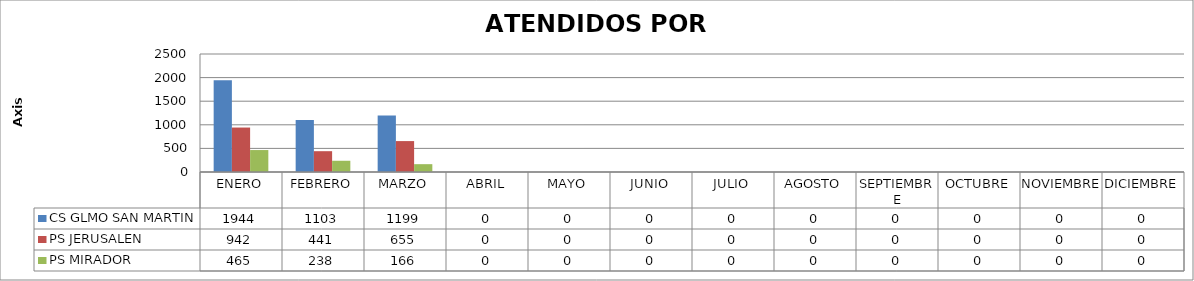
| Category | CS GLMO SAN MARTIN | PS JERUSALEN | PS MIRADOR |
|---|---|---|---|
| ENERO | 1944 | 942 | 465 |
| FEBRERO | 1103 | 441 | 238 |
| MARZO | 1199 | 655 | 166 |
| ABRIL | 0 | 0 | 0 |
| MAYO | 0 | 0 | 0 |
| JUNIO | 0 | 0 | 0 |
| JULIO | 0 | 0 | 0 |
| AGOSTO | 0 | 0 | 0 |
| SEPTIEMBRE | 0 | 0 | 0 |
| OCTUBRE | 0 | 0 | 0 |
| NOVIEMBRE | 0 | 0 | 0 |
| DICIEMBRE | 0 | 0 | 0 |